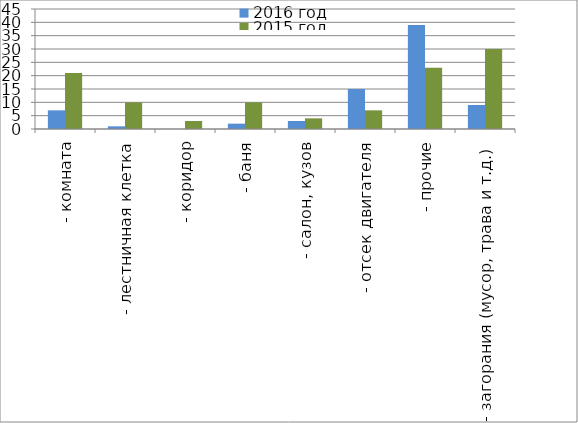
| Category | 2016 год | 2015 год |
|---|---|---|
|  - комната | 7 | 21 |
|  - лестничная клетка | 1 | 10 |
|  - коридор | 0 | 3 |
|  - баня | 2 | 10 |
|  - салон, кузов | 3 | 4 |
|  - отсек двигателя | 15 | 7 |
| - прочие | 39 | 23 |
| - загорания (мусор, трава и т.д.)  | 9 | 30 |